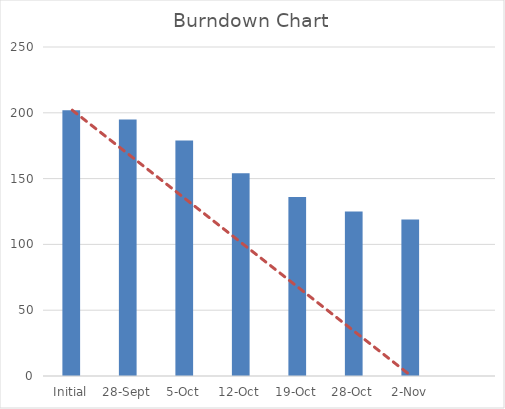
| Category | actual |
|---|---|
| Initial | 202 |
| 28-Sep | 195 |
| 5-Oct | 179 |
| 12-Oct | 154 |
| 19-Oct | 136 |
| 28-Oct | 125 |
| 2-Nov | 119 |